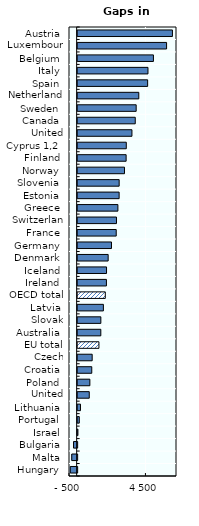
| Category | Foreign-born |
|---|---|
| Hungary | -450.095 |
| Malta | -352.117 |
| Bulgaria | -235.39 |
| Israel | 18.87 |
| Portugal | 108.037 |
| Lithuania | 184.945 |
| United Kingdom | 760.164 |
| Poland | 800.062 |
| Croatia | 924.553 |
| Czech Republic | 951.323 |
| EU total (28) | 1392.884 |
| Australia | 1516.046 |
| Slovak Republic | 1518.776 |
| Latvia | 1685.359 |
| OECD total (29) | 1809.348 |
| Ireland | 1883.284 |
| Iceland | 1890.409 |
| Denmark | 1997.075 |
| Germany | 2214.069 |
| France | 2523.867 |
| Switzerland | 2540.91 |
| Greece | 2633.225 |
| Estonia | 2714.333 |
| Slovenia | 2716.45 |
| Norway | 3064.99 |
| Finland | 3172.351 |
| Cyprus 1,2 | 3182.474 |
| United States | 3552.08 |
| Canada | 3768.824 |
| Sweden | 3829.32 |
| Netherlands | 4000.506 |
| Spain | 4580.014 |
| Italy | 4601.228 |
| Belgium | 4957.508 |
| Luxembourg | 5818.59 |
| Austria | 6200.684 |